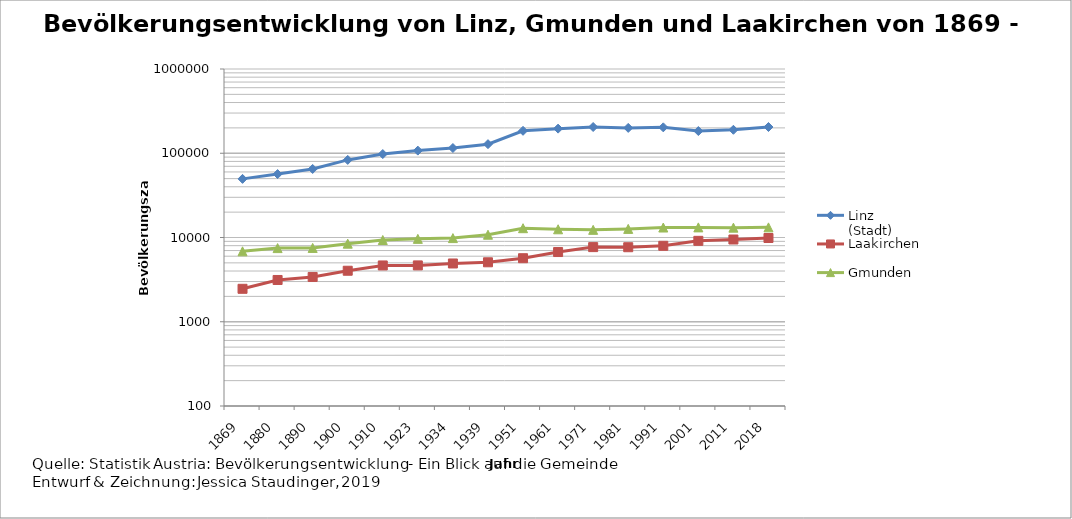
| Category | Linz (Stadt) | Laakirchen | Gmunden |
|---|---|---|---|
| 1869.0 | 49635 | 2461 | 6857 |
| 1880.0 | 56569 | 3132 | 7485 |
| 1890.0 | 65090 | 3402 | 7521 |
| 1900.0 | 83356 | 4032 | 8451 |
| 1910.0 | 97852 | 4658 | 9332 |
| 1923.0 | 107463 | 4663 | 9633 |
| 1934.0 | 115338 | 4916 | 9838 |
| 1939.0 | 128177 | 5079 | 10792 |
| 1951.0 | 184685 | 5677 | 12894 |
| 1961.0 | 195978 | 6722 | 12518 |
| 1971.0 | 204889 | 7687 | 12331 |
| 1981.0 | 199910 | 7666 | 12653 |
| 1991.0 | 203044 | 7968 | 13133 |
| 2001.0 | 183504 | 9130 | 13184 |
| 2011.0 | 189889 | 9468 | 13086 |
| 2018.0 | 204846 | 9861 | 13191 |